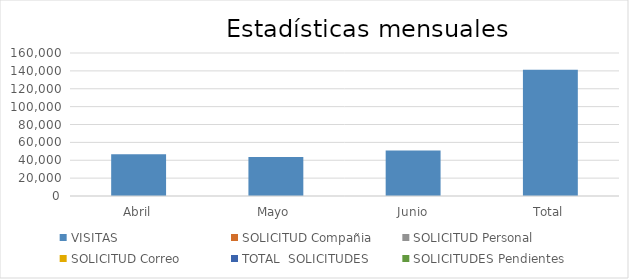
| Category | VISITAS | SOLICITUD Compañia | SOLICITUD Personal | SOLICITUD Correo | TOTAL  SOLICITUDES | SOLICITUDES Pendientes |
|---|---|---|---|---|---|---|
| Abril | 46610 | 0 | 0 | 1 | 1 | 0 |
| Mayo | 43704 | 0 | 0 | 2 | 2 | 0 |
| Junio | 50976 | 0 | 0 | 0 | 0 | 0 |
| Total | 141290 | 0 | 0 | 3 | 3 | 0 |